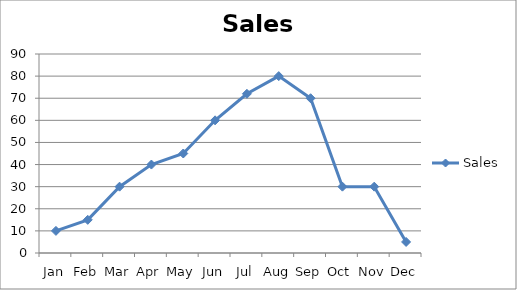
| Category | Sales |
|---|---|
| Jan | 10 |
| Feb | 15 |
| Mar | 30 |
| Apr | 40 |
| May | 45 |
| Jun | 60 |
| Jul | 72 |
| Aug | 80 |
| Sep | 70 |
| Oct | 30 |
| Nov | 30 |
| Dec | 5 |